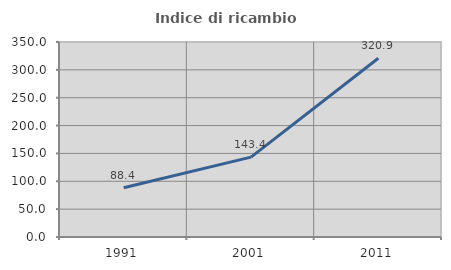
| Category | Indice di ricambio occupazionale  |
|---|---|
| 1991.0 | 88.351 |
| 2001.0 | 143.413 |
| 2011.0 | 320.896 |